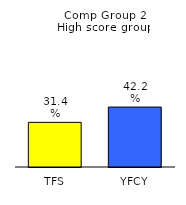
| Category | Series 0 |
|---|---|
| TFS | 0.314 |
| YFCY | 0.422 |